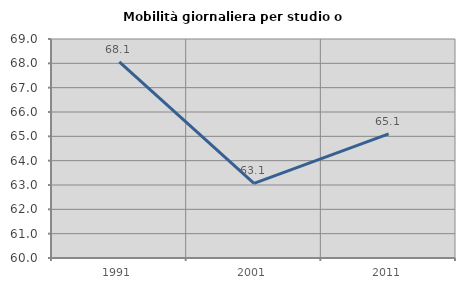
| Category | Mobilità giornaliera per studio o lavoro |
|---|---|
| 1991.0 | 68.064 |
| 2001.0 | 63.07 |
| 2011.0 | 65.1 |